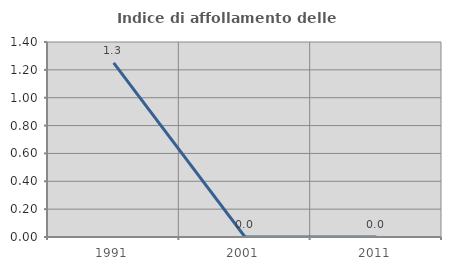
| Category | Indice di affollamento delle abitazioni  |
|---|---|
| 1991.0 | 1.25 |
| 2001.0 | 0 |
| 2011.0 | 0 |